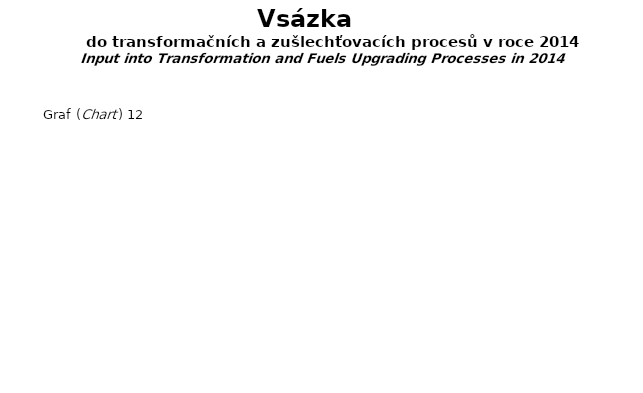
| Category | Výroba tepla (Heat Production) Výroba elektřiny (Electricity Production) Koksování (Coking Plants) Zplynování uhlí (Gasificat.of Coal) Zpracování ropy (Liquid Fuels Prod.) Vysokopecní proc. (Blast Furnaces) Výroba gen. plynu a energoplynu (Generat. Statio |
|---|---|
| Výroba tepla (Heat Production) | 0 |
| Výroba elektřiny (Electricity Production) | 0 |
| Koksování (Coking Plants) | 0 |
| Zplynování uhlí (Gasificat.of Coal) | 0 |
| Zpracování ropy (Liquid Fuels Prod.) | 0 |
| Vysokopecní proc. (Blast Furnaces) | 0 |
| Výroba gen. plynu a energoplynu (Generat. Stations) | 0 |